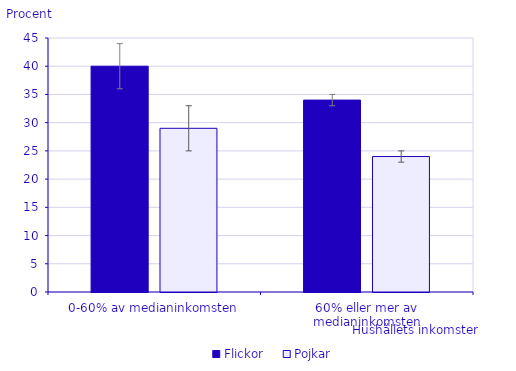
| Category | Flickor | Pojkar |
|---|---|---|
| 0-60% av medianinkomsten | 40 | 29 |
| 60% eller mer av medianinkomsten | 34 | 24 |